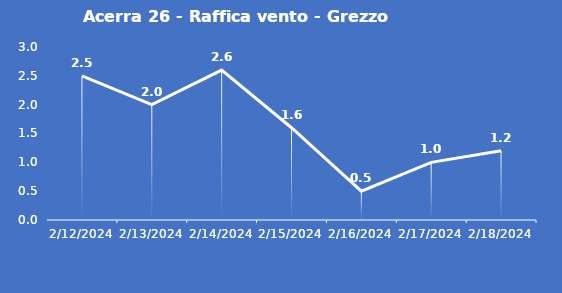
| Category | Acerra 26 - Raffica vento - Grezzo (m/s) |
|---|---|
| 2/12/24 | 2.5 |
| 2/13/24 | 2 |
| 2/14/24 | 2.6 |
| 2/15/24 | 1.6 |
| 2/16/24 | 0.5 |
| 2/17/24 | 1 |
| 2/18/24 | 1.2 |